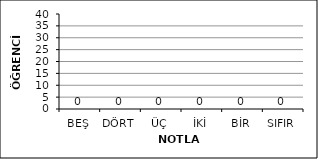
| Category | Series 0 |
|---|---|
| BEŞ | 0 |
| DÖRT | 0 |
| ÜÇ | 0 |
| İKİ | 0 |
| BİR | 0 |
| SIFIR | 0 |